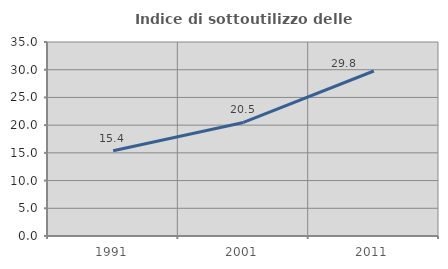
| Category | Indice di sottoutilizzo delle abitazioni  |
|---|---|
| 1991.0 | 15.394 |
| 2001.0 | 20.489 |
| 2011.0 | 29.771 |